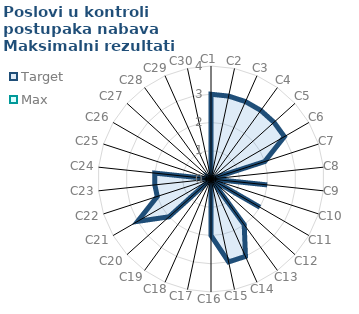
| Category | Target | Max |
|---|---|---|
| C1 | 3 | 0 |
| C2 | 3 | 0 |
| C3 | 3 | 0 |
| C4 | 3 | 0 |
| C5 | 3 | 0 |
| C6 | 3 | 0 |
| C7 | 2 | 0 |
| C8 | 0 | 0 |
| C9 | 2 | 0 |
| C10 | 0 | 0 |
| C11 | 2 | 0 |
| C12 | 0 | 0 |
| C13 | 2 | 0 |
| C14 | 3 | 0 |
| C15 | 3 | 0 |
| C16 | 2 | 0 |
| C17 | 0 | 0 |
| C18 | 0 | 0 |
| C19 | 0 | 0 |
| C20 | 2 | 0 |
| C21 | 3 | 0 |
| C22 | 2 | 0 |
| C23 | 2 | 0 |
| C24 | 2 | 0 |
| C25 | 0 | 0 |
| C26 | 0 | 0 |
| C27 | 0 | 0 |
| C28 | 0 | 0 |
| C29 | 0 | 0 |
| C30 | 0 | 0 |